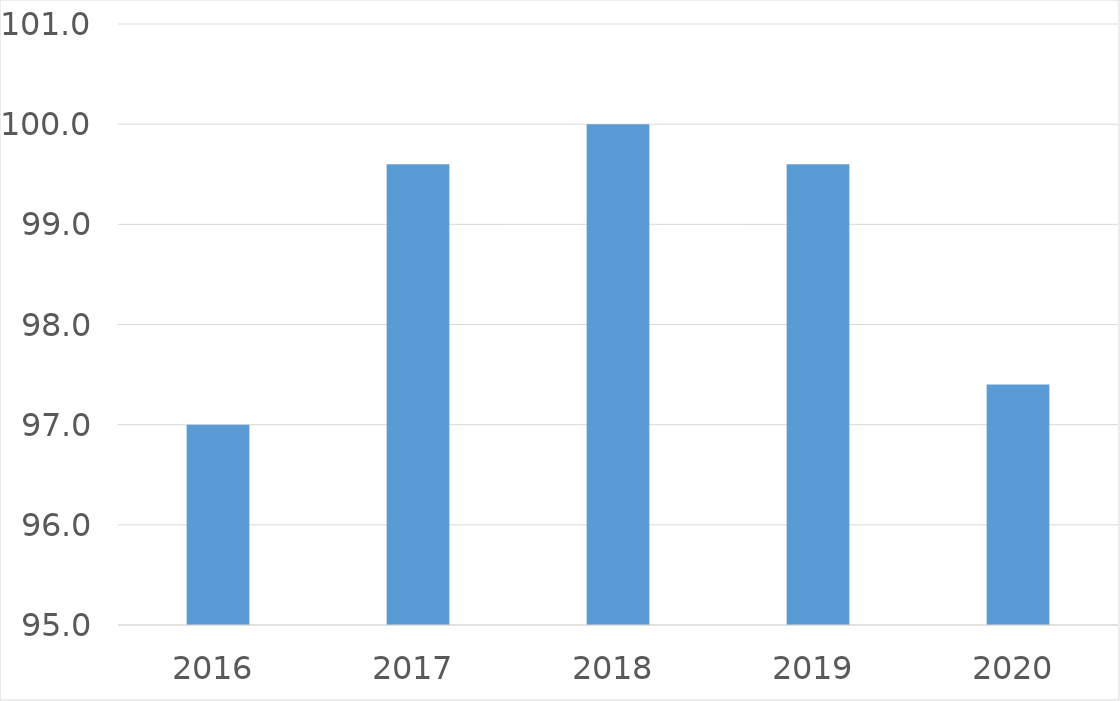
| Category | Series 0 |
|---|---|
| 2016 | 97 |
| 2017 | 99.6 |
| 2018 | 100 |
| 2019 | 99.6 |
| 2020 | 97.4 |